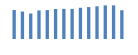
| Category | Exportações (1) |
|---|---|
| 0 | 392293.987 |
| 1 | 370979.678 |
| 2 | 344221.998 |
| 3 | 386156.652 |
| 4 | 390987.572 |
| 5 | 406063.094 |
| 6 | 407598.054 |
| 7 | 406953.169 |
| 8 | 421887.391 |
| 9 | 431264.801 |
| 10 | 442364.452 |
| 11 | 454202.095 |
| 12 | 454929.952 |
| 13 | 388747.847 |